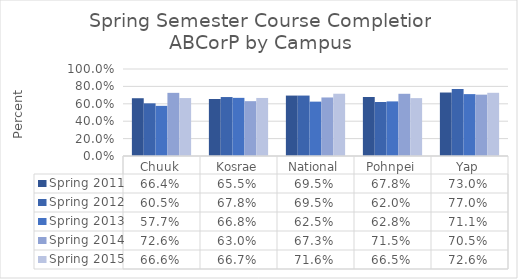
| Category | Spring 2011 | Spring 2012 | Spring 2013 | Spring 2014 | Spring 2015 |
|---|---|---|---|---|---|
| Chuuk | 0.664 | 0.605 | 0.577 | 0.726 | 0.666 |
| Kosrae | 0.655 | 0.678 | 0.668 | 0.63 | 0.667 |
| National | 0.695 | 0.695 | 0.625 | 0.673 | 0.716 |
| Pohnpei | 0.678 | 0.62 | 0.628 | 0.715 | 0.665 |
| Yap | 0.73 | 0.77 | 0.711 | 0.705 | 0.726 |